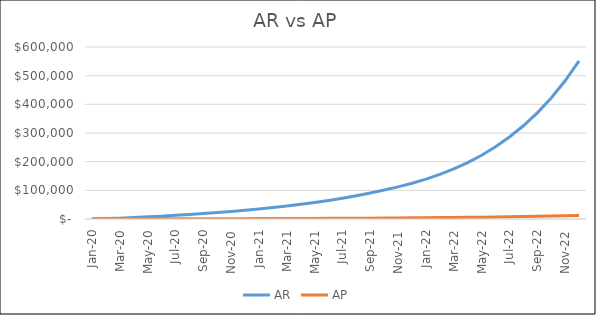
| Category | AR | AP |
|---|---|---|
| 2020-01-01 | 221.918 | 443.836 |
| 2020-02-29 | 1326.487 | 488.219 |
| 2020-03-31 | 2960.867 | 537.041 |
| 2020-04-30 | 5113.073 | 590.745 |
| 2020-05-31 | 7438.516 | 649.82 |
| 2020-06-30 | 9955.469 | 714.802 |
| 2020-07-31 | 12684.012 | 786.282 |
| 2020-08-31 | 15646.211 | 864.91 |
| 2020-09-30 | 18866.317 | 951.401 |
| 2020-10-31 | 22370.988 | 1046.541 |
| 2020-11-30 | 26189.528 | 1151.195 |
| 2020-12-31 | 30354.151 | 1266.315 |
| 2021-01-31 | 34900.275 | 1392.946 |
| 2021-02-28 | 39866.84 | 1532.241 |
| 2021-03-31 | 45296.664 | 1685.465 |
| 2021-04-30 | 51236.828 | 1854.012 |
| 2021-05-31 | 57739.105 | 2039.413 |
| 2021-06-30 | 64860.426 | 2243.354 |
| 2021-07-31 | 72663.403 | 2467.689 |
| 2021-08-31 | 81216.889 | 2714.458 |
| 2021-09-30 | 90596.61 | 2985.904 |
| 2021-10-31 | 100885.848 | 3284.494 |
| 2021-11-30 | 112176.197 | 3612.944 |
| 2021-12-31 | 124568.399 | 3974.238 |
| 2022-01-31 | 138919.729 | 4371.662 |
| 2022-02-28 | 155521.788 | 4808.828 |
| 2022-03-31 | 174709.967 | 5289.711 |
| 2022-04-30 | 196870.019 | 5818.682 |
| 2022-05-31 | 222445.605 | 6400.551 |
| 2022-06-30 | 251946.985 | 7040.606 |
| 2022-07-31 | 285961.005 | 7744.666 |
| 2022-08-31 | 325162.584 | 8519.133 |
| 2022-09-30 | 370327.922 | 9371.046 |
| 2022-10-31 | 422349.694 | 10308.151 |
| 2022-11-30 | 482254.519 | 11338.966 |
| 2022-12-31 | 551223.049 | 12472.862 |